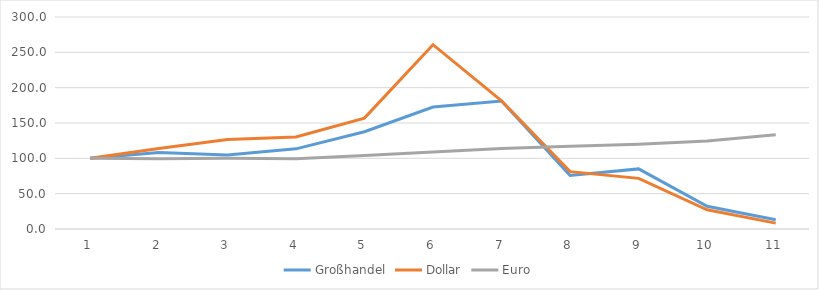
| Category | Großhandel | Dollar | Euro |
|---|---|---|---|
| 1.0 | 100 | 100 | 100 |
| 2.0 | 108.246 | 113.946 | 99.508 |
| 3.0 | 104.583 | 126.773 | 100.045 |
| 4.0 | 113.406 | 130.229 | 99.246 |
| 5.0 | 137.635 | 156.907 | 103.865 |
| 6.0 | 172.618 | 260.786 | 108.823 |
| 7.0 | 181.038 | 181.312 | 114.011 |
| 8.0 | 75.807 | 81.143 | 117.04 |
| 9.0 | 85.069 | 71.666 | 119.854 |
| 10.0 | 32.241 | 27.109 | 124.415 |
| 11.0 | 13.016 | 8.351 | 133.329 |